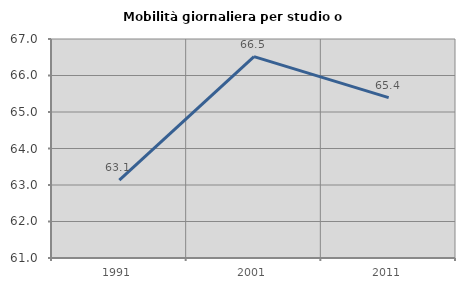
| Category | Mobilità giornaliera per studio o lavoro |
|---|---|
| 1991.0 | 63.131 |
| 2001.0 | 66.519 |
| 2011.0 | 65.392 |